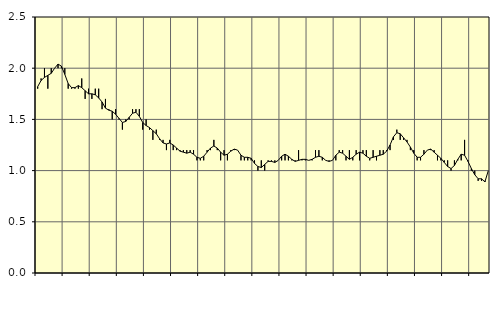
| Category | Piggar | Jordbruk, skogsbruk o fiske, SNI 01-03 |
|---|---|---|
| nan | 1.8 | 1.82 |
| 87.0 | 1.9 | 1.88 |
| 87.0 | 2 | 1.91 |
| 87.0 | 1.8 | 1.93 |
| nan | 2 | 1.95 |
| 88.0 | 2 | 2 |
| 88.0 | 2 | 2.04 |
| 88.0 | 2 | 2.02 |
| nan | 2 | 1.94 |
| 89.0 | 1.8 | 1.85 |
| 89.0 | 1.8 | 1.81 |
| 89.0 | 1.8 | 1.81 |
| nan | 1.8 | 1.83 |
| 90.0 | 1.9 | 1.81 |
| 90.0 | 1.7 | 1.78 |
| 90.0 | 1.8 | 1.75 |
| nan | 1.7 | 1.75 |
| 91.0 | 1.8 | 1.74 |
| 91.0 | 1.8 | 1.71 |
| 91.0 | 1.6 | 1.67 |
| nan | 1.7 | 1.61 |
| 92.0 | 1.6 | 1.59 |
| 92.0 | 1.5 | 1.58 |
| 92.0 | 1.6 | 1.55 |
| nan | 1.5 | 1.51 |
| 93.0 | 1.4 | 1.47 |
| 93.0 | 1.5 | 1.48 |
| 93.0 | 1.5 | 1.52 |
| nan | 1.6 | 1.56 |
| 94.0 | 1.6 | 1.57 |
| 94.0 | 1.6 | 1.53 |
| 94.0 | 1.4 | 1.47 |
| nan | 1.5 | 1.44 |
| 95.0 | 1.4 | 1.42 |
| 95.0 | 1.3 | 1.39 |
| 95.0 | 1.4 | 1.36 |
| nan | 1.3 | 1.31 |
| 96.0 | 1.3 | 1.27 |
| 96.0 | 1.2 | 1.26 |
| 96.0 | 1.3 | 1.27 |
| nan | 1.2 | 1.25 |
| 97.0 | 1.2 | 1.22 |
| 97.0 | 1.2 | 1.19 |
| 97.0 | 1.2 | 1.18 |
| nan | 1.2 | 1.17 |
| 98.0 | 1.2 | 1.18 |
| 98.0 | 1.2 | 1.16 |
| 98.0 | 1.1 | 1.13 |
| nan | 1.1 | 1.12 |
| 99.0 | 1.1 | 1.14 |
| 99.0 | 1.2 | 1.18 |
| 99.0 | 1.2 | 1.22 |
| nan | 1.3 | 1.24 |
| 0.0 | 1.2 | 1.22 |
| 0.0 | 1.1 | 1.18 |
| 0.0 | 1.2 | 1.15 |
| nan | 1.1 | 1.16 |
| 1.0 | 1.2 | 1.19 |
| 1.0 | 1.2 | 1.21 |
| 1.0 | 1.2 | 1.2 |
| nan | 1.1 | 1.15 |
| 2.0 | 1.1 | 1.13 |
| 2.0 | 1.1 | 1.13 |
| 2.0 | 1.1 | 1.12 |
| nan | 1.1 | 1.07 |
| 3.0 | 1 | 1.04 |
| 3.0 | 1.1 | 1.03 |
| 3.0 | 1 | 1.06 |
| nan | 1.1 | 1.09 |
| 4.0 | 1.1 | 1.09 |
| 4.0 | 1.1 | 1.08 |
| 4.0 | 1.1 | 1.1 |
| nan | 1.1 | 1.14 |
| 5.0 | 1.1 | 1.16 |
| 5.0 | 1.1 | 1.14 |
| 5.0 | 1.1 | 1.11 |
| nan | 1.1 | 1.09 |
| 6.0 | 1.2 | 1.1 |
| 6.0 | 1.1 | 1.11 |
| 6.0 | 1.1 | 1.11 |
| nan | 1.1 | 1.1 |
| 7.0 | 1.1 | 1.11 |
| 7.0 | 1.2 | 1.13 |
| 7.0 | 1.2 | 1.14 |
| nan | 1.1 | 1.13 |
| 8.0 | 1.1 | 1.1 |
| 8.0 | 1.1 | 1.09 |
| 8.0 | 1.1 | 1.1 |
| nan | 1.1 | 1.15 |
| 9.0 | 1.2 | 1.18 |
| 9.0 | 1.2 | 1.17 |
| 9.0 | 1.1 | 1.14 |
| nan | 1.2 | 1.11 |
| 10.0 | 1.1 | 1.13 |
| 10.0 | 1.2 | 1.16 |
| 10.0 | 1.1 | 1.18 |
| nan | 1.2 | 1.17 |
| 11.0 | 1.2 | 1.14 |
| 11.0 | 1.1 | 1.12 |
| 11.0 | 1.2 | 1.13 |
| nan | 1.1 | 1.14 |
| 12.0 | 1.2 | 1.15 |
| 12.0 | 1.2 | 1.16 |
| 12.0 | 1.2 | 1.19 |
| nan | 1.2 | 1.25 |
| 13.0 | 1.3 | 1.33 |
| 13.0 | 1.4 | 1.37 |
| 13.0 | 1.3 | 1.36 |
| nan | 1.3 | 1.32 |
| 14.0 | 1.3 | 1.28 |
| 14.0 | 1.2 | 1.23 |
| 14.0 | 1.2 | 1.17 |
| nan | 1.1 | 1.13 |
| 15.0 | 1.1 | 1.13 |
| 15.0 | 1.2 | 1.16 |
| 15.0 | 1.2 | 1.2 |
| nan | 1.2 | 1.21 |
| 16.0 | 1.2 | 1.18 |
| 16.0 | 1.1 | 1.15 |
| 16.0 | 1.1 | 1.12 |
| nan | 1.1 | 1.08 |
| 17.0 | 1.1 | 1.04 |
| 17.0 | 1 | 1.02 |
| 17.0 | 1.1 | 1.05 |
| nan | 1.1 | 1.11 |
| 18.0 | 1.1 | 1.16 |
| 18.0 | 1.3 | 1.15 |
| 18.0 | 1.1 | 1.09 |
| nan | 1 | 1.02 |
| 19.0 | 1 | 0.96 |
| 19.0 | 0.9 | 0.92 |
| 19.0 | 0.9 | 0.92 |
| nan | 0.9 | 0.89 |
| 20.0 | 1 | 1 |